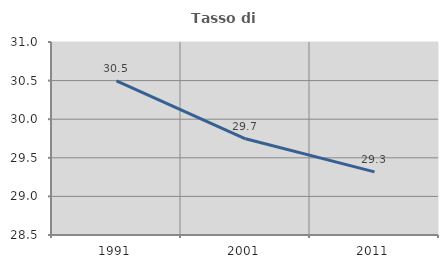
| Category | Tasso di occupazione   |
|---|---|
| 1991.0 | 30.498 |
| 2001.0 | 29.746 |
| 2011.0 | 29.317 |